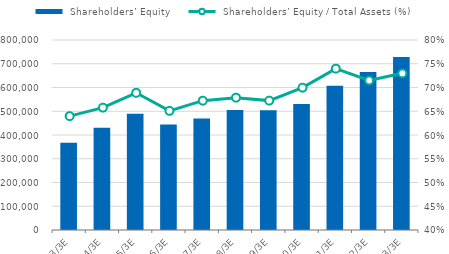
| Category |  Shareholders’ Equity |
|---|---|
| 2013-03-31 | 366962 |
| 2014-03-31 | 430509 |
| 2015-03-31 | 489769 |
| 2016-03-31 | 444718 |
| 2017-03-31 | 469029 |
| 2018-03-31 | 505530 |
| 2019-03-31 | 504212 |
| 2020-03-31 | 530415 |
| 2021-03-31 | 606858 |
| 2022-03-31 | 665227 |
| 2023-03-31 | 728473 |